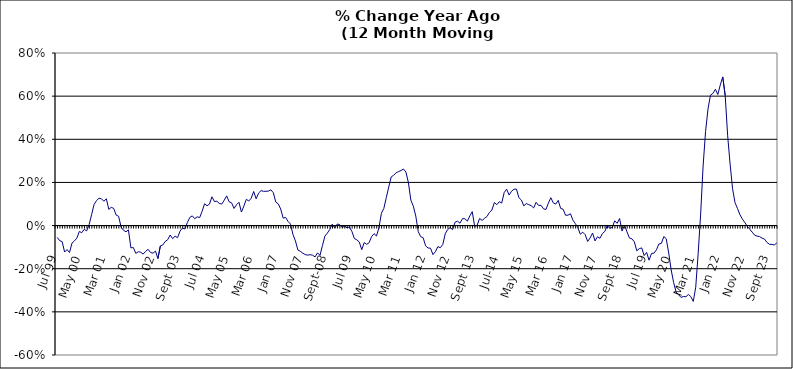
| Category | Series 0 |
|---|---|
| Jul 99 | -0.055 |
| Aug 99 | -0.07 |
| Sep 99 | -0.074 |
| Oct 99 | -0.123 |
| Nov 99 | -0.111 |
| Dec 99 | -0.125 |
| Jan 00 | -0.082 |
| Feb 00 | -0.071 |
| Mar 00 | -0.058 |
| Apr 00 | -0.027 |
| May 00 | -0.033 |
| Jun 00 | -0.017 |
| Jul 00 | -0.025 |
| Aug 00 | 0.005 |
| Sep 00 | 0.05 |
| Oct 00 | 0.098 |
| Nov 00 | 0.116 |
| Dec 00 | 0.127 |
| Jan 01 | 0.124 |
| Feb 01 | 0.113 |
| Mar 01 | 0.124 |
| Apr 01 | 0.075 |
| May 01 | 0.085 |
| Jun 01 | 0.08 |
| Jul 01 | 0.048 |
| Aug 01 | 0.043 |
| Sep 01 | -0.007 |
| Oct 01 | -0.022 |
| Nov 01 | -0.029 |
| Dec 01 | -0.02 |
| Jan 02 | -0.103 |
| Feb 02 | -0.102 |
| Mar 02 | -0.129 |
| Apr 02 | -0.121 |
| May 02 | -0.124 |
| Jun 02 | -0.132 |
| Jul 02 | -0.119 |
| Aug 02 | -0.11 |
| Sep 02 | -0.125 |
| Oct 02 | -0.128 |
| Nov 02 | -0.118 |
| Dec 02 | -0.153 |
| Jan 03 | -0.094 |
| Feb 03 | -0.09 |
| Mar 03 | -0.073 |
| Apr 03 | -0.065 |
| May 03 | -0.044 |
| Jun 03 | -0.06 |
| Jul 03 | -0.049 |
| Aug 03 | -0.056 |
| Sep 03 | -0.026 |
| Oct 03 | -0.012 |
| Nov 03 | -0.016 |
| Dec 03 | 0.014 |
| Jan 04 | 0.038 |
| Feb 04 | 0.045 |
| Mar 04 | 0.032 |
| Apr 04 | 0.041 |
| May 04 | 0.037 |
| Jun 04 | 0.066 |
| Jul 04 | 0.101 |
| Aug 04 | 0.092 |
| Sep 04 | 0.1 |
| Oct 04 | 0.133 |
| Nov 04 | 0.111 |
| Dec 04 | 0.113 |
| Jan 05 | 0.103 |
| Feb 05 | 0.1 |
| Mar 05 | 0.118 |
| Apr 05 | 0.138 |
| May 05 | 0.11 |
| Jun 05 | 0.106 |
| Jul 05 | 0.079 |
| Aug 05 | 0.097 |
| Sep 05 | 0.108 |
| Oct 05 | 0.063 |
| Nov 05 | 0.09 |
| Dec 05 | 0.122 |
| Jan 06 | 0.114 |
| Feb 06 | 0.127 |
| Mar 06 | 0.158 |
| Apr 06 | 0.124 |
| May 06 | 0.151 |
| Jun 06 | 0.162 |
| Jul 06 | 0.159 |
| Aug 06 | 0.159 |
| Sep 06 | 0.16 |
| Oct 06 | 0.166 |
| Nov 06 | 0.152 |
| Dec 06 | 0.109 |
| Jan 07 | 0.101 |
| Feb 07 | 0.076 |
| Mar 07 | 0.034 |
| Apr 07 | 0.038 |
| May 07 | 0.019 |
| Jun 07 | 0.007 |
| Jul 07 | -0.041 |
| Aug 07 | -0.071 |
| Sep 07 | -0.113 |
| Oct 07 | -0.12 |
| Nov 07 | -0.128 |
| Dec 07 | -0.135 |
| Jan 08 | -0.137 |
| Feb 08 | -0.135 |
| Mar 08 | -0.137 |
| Apr 08 | -0.145 |
| May 08 | -0.126 |
| Jun 08 | -0.138 |
| Jul 08 | -0.093 |
| Aug 08 | -0.049 |
| Sep-08 | -0.035 |
| Oct 08 | -0.018 |
| Nov 08 | 0.007 |
| Dec 08 | -0.011 |
| Jan 09 | 0.007 |
| Feb 09 | 0.005 |
| Mar 09 | -0.009 |
| Apr 09 | -0.003 |
| May 09 | -0.01 |
| Jun 09 | -0.007 |
| Jul 09 | -0.027 |
| Aug 09 | -0.06 |
| Sep 09 | -0.066 |
| Oct 09 | -0.076 |
| Nov 09 | -0.112 |
| Dec 09 | -0.079 |
| Jan 10 | -0.087 |
| Feb 10 | -0.079 |
| Mar 10 | -0.052 |
| Apr 10 | -0.037 |
| May 10 | -0.048 |
| Jun 10 | -0.01 |
| Jul 10 | 0.057 |
| Aug 10 | 0.08 |
| Sep 10 | 0.13 |
| Oct 10 | 0.179 |
| Nov 10 | 0.226 |
| Dec 10 | 0.233 |
| Jan 11 | 0.245 |
| Feb 11 | 0.25 |
| Mar 11 | 0.255 |
| Apr 11 | 0.262 |
| May 11 | 0.248 |
| Jun 11 | 0.199 |
| Jul 11 | 0.118 |
| Aug 11 | 0.09 |
| Sep 11 | 0.044 |
| Oct 11 | -0.028 |
| Nov 11 | -0.051 |
| Dec 11 | -0.056 |
| Jan 12 | -0.094 |
| Feb 12 | -0.104 |
| Mar 12 | -0.105 |
| Apr 12 | -0.134 |
| May 12 | -0.121 |
| Jun 12 | -0.098 |
| Jul 12 | -0.103 |
| Aug 12 | -0.087 |
| Sep 12 | -0.038 |
| Oct 12 | -0.018 |
| Nov 12 | -0.009 |
| Dec 12 | -0.019 |
| Jan 13 | 0.016 |
| Feb-13 | 0.02 |
| Mar-13 | 0.011 |
| Apr 13 | 0.032 |
| May 13 | 0.032 |
| Jun-13 | 0.021 |
| Jul 13 | 0.045 |
| Aug 13 | 0.065 |
| Sep 13 | -0.005 |
| Oct 13 | 0.002 |
| Nov 13 | 0.033 |
| Dec 13 | 0.024 |
| Jan 14 | 0.034 |
| Feb-14 | 0.042 |
| Mar 14 | 0.061 |
| Apr 14 | 0.072 |
| May 14 | 0.107 |
| Jun 14 | 0.097 |
| Jul-14 | 0.111 |
| Aug-14 | 0.105 |
| Sep 14 | 0.153 |
| Oct 14 | 0.169 |
| Nov 14 | 0.141 |
| Dec 14 | 0.159 |
| Jan 15 | 0.169 |
| Feb 15 | 0.169 |
| Mar 15 | 0.129 |
| Apr-15 | 0.118 |
| May 15 | 0.091 |
| Jun-15 | 0.102 |
| Jul 15 | 0.097 |
| Aug 15 | 0.092 |
| Sep 15 | 0.082 |
| Oct 15 | 0.108 |
| Nov 15 | 0.093 |
| Dec 15 | 0.094 |
| Jan 16 | 0.078 |
| Feb 16 | 0.075 |
| Mar 16 | 0.104 |
| Apr 16 | 0.129 |
| May 16 | 0.105 |
| Jun 16 | 0.1 |
| Jul 16 | 0.117 |
| Aug 16 | 0.08 |
| Sep 16 | 0.076 |
| Oct 16 | 0.048 |
| Nov 16 | 0.048 |
| Dec 16 | 0.055 |
| Jan 17 | 0.025 |
| Feb 17 | 0.009 |
| Mar 17 | -0.01 |
| Apr 17 | -0.04 |
| May 17 | -0.031 |
| Jun 17 | -0.042 |
| Jul 17 | -0.074 |
| Aug 17 | -0.057 |
| Sep 17 | -0.035 |
| Oct 17 | -0.071 |
| Nov 17 | -0.052 |
| Dec 17 | -0.059 |
| Jan 18 | -0.037 |
| Feb 18 | -0.027 |
| Mar 18 | 0 |
| Apr 18 | -0.012 |
| May 18 | -0.009 |
| Jun 18 | 0.022 |
| Jul 18 | 0.01 |
| Aug 18 | 0.033 |
| Sep 18 | -0.025 |
| Oct 18 | 0.002 |
| Nov 18 | -0.029 |
| Dec 18 | -0.058 |
| Jan 19 | -0.061 |
| Feb 19 | -0.075 |
| Mar 19 | -0.117 |
| Apr 19 | -0.107 |
| May 19 | -0.104 |
| Jun 19 | -0.139 |
| Jul 19 | -0.124 |
| Aug 19 | -0.16 |
| Sep 19 | -0.129 |
| Oct 19 | -0.128 |
| Nov 19 | -0.112 |
| Dec 19 | -0.085 |
| Jan 20 | -0.083 |
| Feb 20 | -0.051 |
| Mar 20 | -0.061 |
| Apr 20 | -0.127 |
| May 20 | -0.206 |
| Jun 20 | -0.264 |
| Jul 20 | -0.308 |
| Aug 20 | -0.32 |
| Sep 20 | -0.333 |
| Oct 20 | -0.329 |
| Nov 20 | -0.33 |
| Dec 20 | -0.319 |
| Jan 21 | -0.329 |
| Feb 21 | -0.352 |
| Mar 21 | -0.286 |
| Apr 21 | -0.129 |
| May 21 | 0.053 |
| Jun 21 | 0.276 |
| Jul 21 | 0.435 |
| Aug 21 | 0.541 |
| Sep 21 | 0.604 |
| Oct 21 | 0.613 |
| Nov 21 | 0.632 |
| Dec 21 | 0.608 |
| Jan 22 | 0.652 |
| Feb 22 | 0.689 |
| Mar 22 | 0.603 |
| Apr 22 | 0.416 |
| May 22 | 0.285 |
| Jun 22 | 0.171 |
| Jul 22 | 0.106 |
| Aug 22 | 0.079 |
| Sep 22 | 0.051 |
| Oct 22 | 0.03 |
| Nov 22 | 0.014 |
| Dec 22 | -0.004 |
| Jan 23 | -0.017 |
| Feb 23 | -0.031 |
| Mar 23 | -0.045 |
| Apr 23 | -0.049 |
| May 23 | -0.051 |
| Jun 23 | -0.058 |
| Jul 23 | -0.062 |
| Aug 23 | -0.078 |
| Sep 23 | -0.087 |
| Oct 23 | -0.087 |
| Nov 23 | -0.09 |
| Dec 23 | -0.081 |